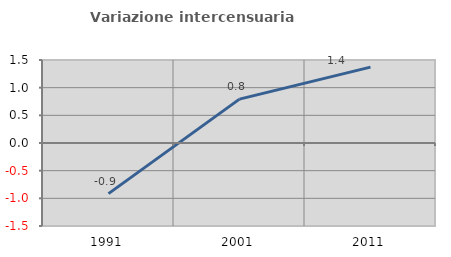
| Category | Variazione intercensuaria annua |
|---|---|
| 1991.0 | -0.914 |
| 2001.0 | 0.793 |
| 2011.0 | 1.371 |